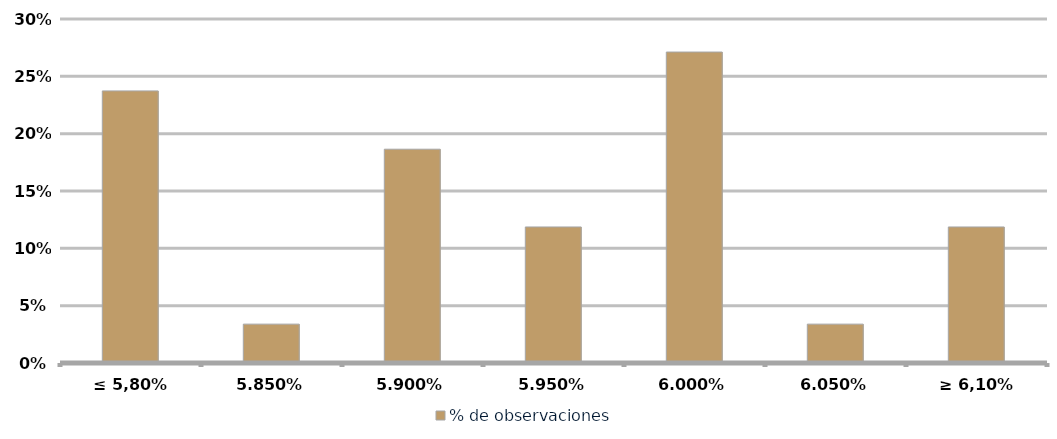
| Category | % de observaciones  |
|---|---|
| ≤ 5,80% | 0.237 |
| 5.85% | 0.034 |
| 5.90% | 0.186 |
| 5.95% | 0.119 |
| 6.00% | 0.271 |
| 6.05% | 0.034 |
| ≥ 6,10% | 0.119 |